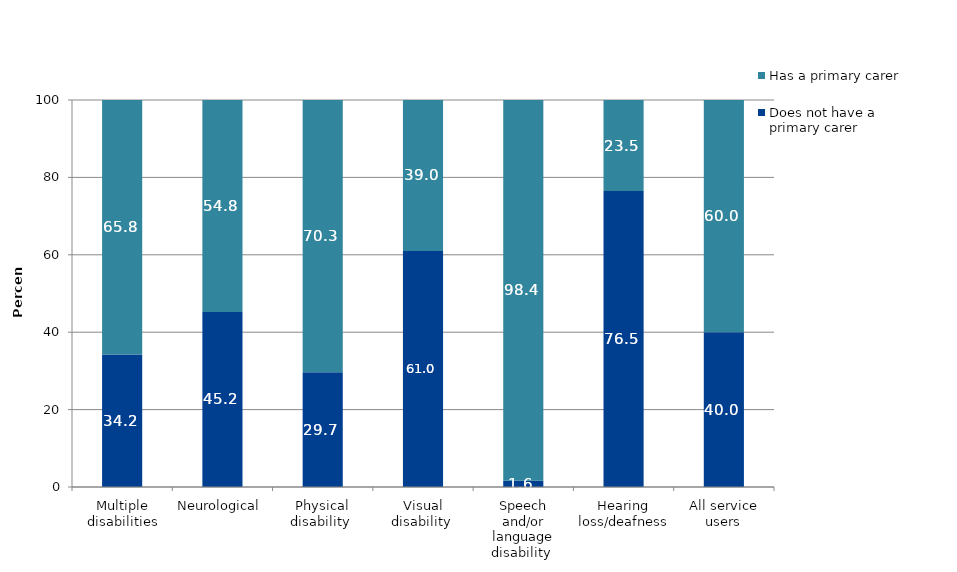
| Category | Does not have a primary carer | Has a primary carer |
|---|---|---|
| Multiple disabilities | 34.207 | 65.793 |
| Neurological  | 45.243 | 54.757 |
| Physical disability  | 29.672 | 70.328 |
| Visual disability  | 61.013 | 38.987 |
| Speech and/or language disability  | 1.628 | 98.372 |
| Hearing loss/deafness | 76.481 | 23.519 |
| All service users | 39.966 | 60.034 |